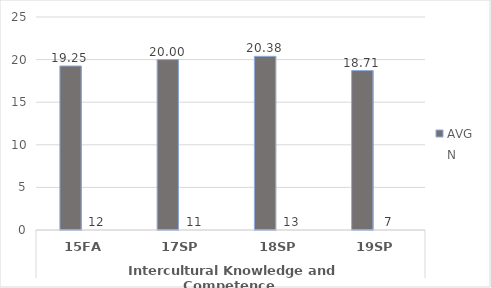
| Category | English - AVG | English - N |
|---|---|---|
| 0 | 19.25 | 12 |
| 1 | 20 | 11 |
| 2 | 20.385 | 13 |
| 3 | 18.714 | 7 |